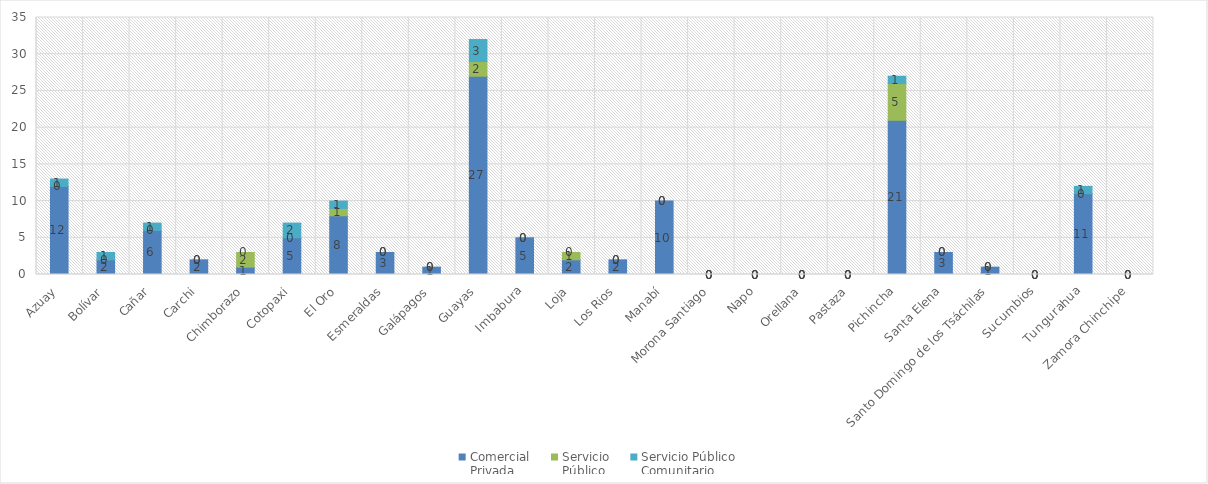
| Category | Comercial 
Privada | Servicio 
Público | Servicio Público
Comunitario |
|---|---|---|---|
| Azuay | 12 | 0 | 1 |
| Bolívar | 2 | 0 | 1 |
| Cañar | 6 | 0 | 1 |
| Carchi | 2 | 0 | 0 |
| Chimborazo | 1 | 2 | 0 |
| Cotopaxi | 5 | 0 | 2 |
| El Oro | 8 | 1 | 1 |
| Esmeraldas | 3 | 0 | 0 |
| Galápagos | 1 | 0 | 0 |
| Guayas | 27 | 2 | 3 |
| Imbabura | 5 | 0 | 0 |
| Loja | 2 | 1 | 0 |
| Los Rios | 2 | 0 | 0 |
| Manabí | 10 | 0 | 0 |
| Morona Santiago | 0 | 0 | 0 |
| Napo | 0 | 0 | 0 |
| Orellana | 0 | 0 | 0 |
| Pastaza | 0 | 0 | 0 |
| Pichincha | 21 | 5 | 1 |
| Santa Elena | 3 | 0 | 0 |
| Santo Domingo de los Tsáchilas | 1 | 0 | 0 |
| Sucumbios | 0 | 0 | 0 |
| Tungurahua | 11 | 0 | 1 |
| Zamora Chinchipe | 0 | 0 | 0 |